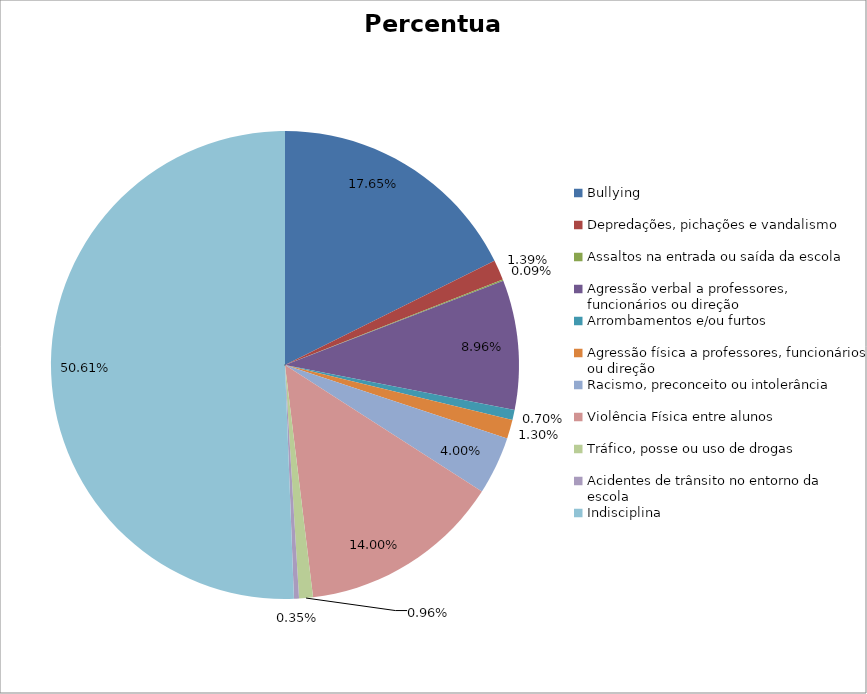
| Category | Percentual |
|---|---|
| Bullying | 0.177 |
| Depredações, pichações e vandalismo | 0.014 |
| Assaltos na entrada ou saída da escola | 0.001 |
| Agressão verbal a professores, funcionários ou direção | 0.09 |
| Arrombamentos e/ou furtos | 0.007 |
| Agressão física a professores, funcionários ou direção | 0.013 |
| Racismo, preconceito ou intolerância | 0.04 |
| Violência Física entre alunos | 0.14 |
| Tráfico, posse ou uso de drogas | 0.01 |
| Acidentes de trânsito no entorno da escola | 0.003 |
| Indisciplina | 0.506 |